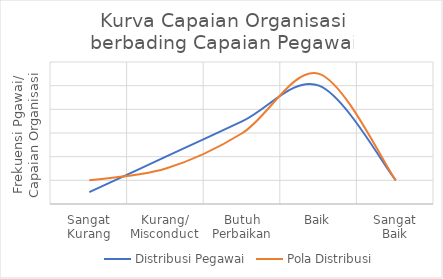
| Category | Distribusi Pegawai | Pola Distribusi |
|---|---|---|
| Sangat
Kurang | 1 | 2 |
| Kurang/
Misconduct | 4 | 3 |
| Butuh
Perbaikan | 7 | 6 |
| Baik | 10 | 11 |
| Sangat
Baik | 2 | 2 |